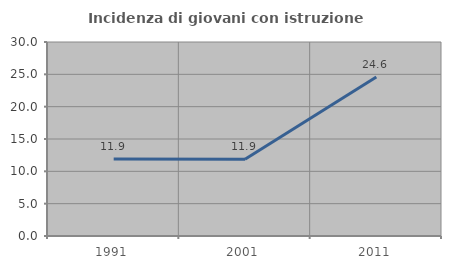
| Category | Incidenza di giovani con istruzione universitaria |
|---|---|
| 1991.0 | 11.894 |
| 2001.0 | 11.881 |
| 2011.0 | 24.599 |